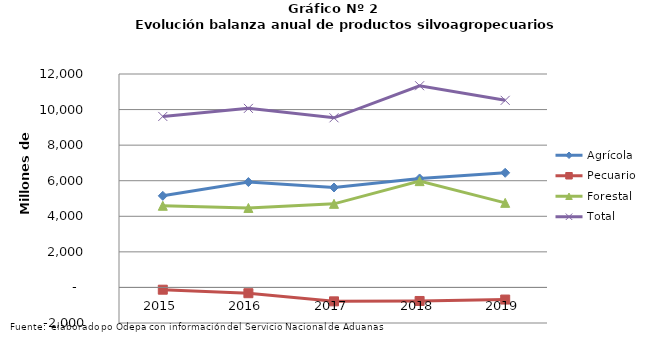
| Category | Agrícola | Pecuario | Forestal | Total |
|---|---|---|---|---|
| 2015.0 | 5149872 | -127785 | 4591408 | 9613495 |
| 2016.0 | 5924661 | -325421 | 4468104 | 10067344 |
| 2017.0 | 5619304 | -782654 | 4700192 | 9536842 |
| 2018.0 | 6126434 | -761998 | 5976134 | 11340570 |
| 2019.0 | 6445965 | -681747 | 4755358 | 10519576 |